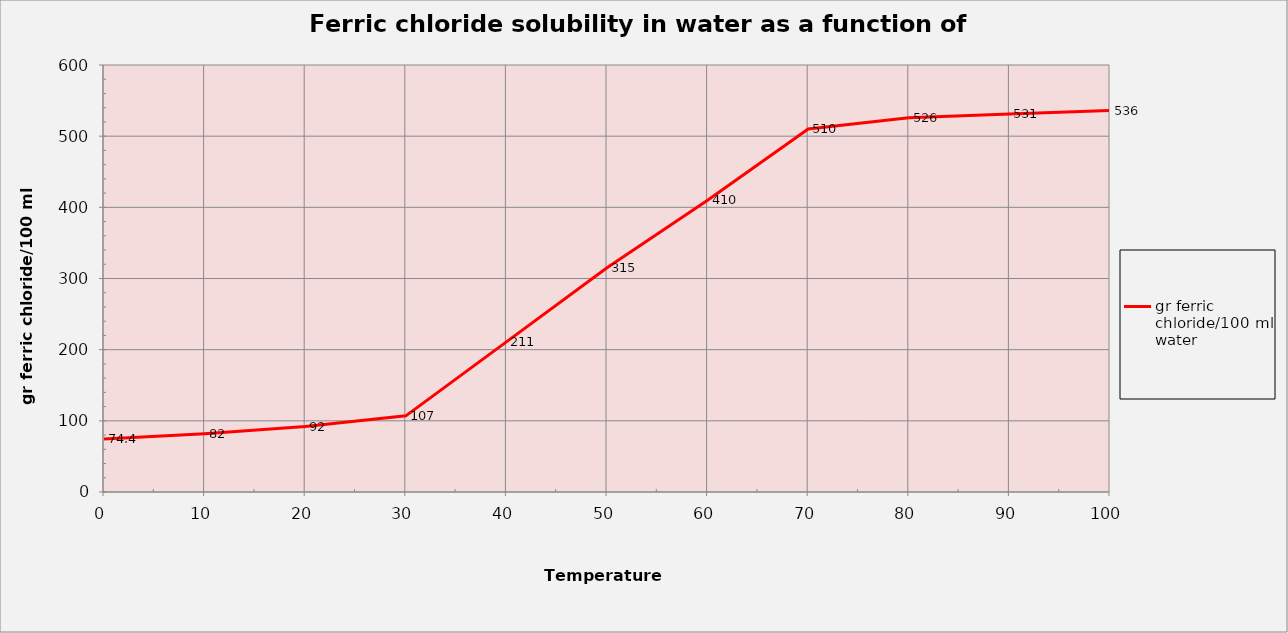
| Category | gr ferric chloride/100 ml water |
|---|---|
| 0.0 | 74.4 |
| 10.0 | 82 |
| 20.0 | 92 |
| 30.0 | 107 |
| 40.0 | 211 |
| 50.0 | 315 |
| 60.0 | 410 |
| 70.0 | 510 |
| 80.0 | 526 |
| 90.0 | 531 |
| 100.0 | 536 |